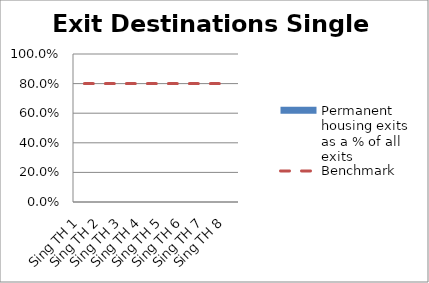
| Category | Permanent housing exits as a % of all exits |
|---|---|
| Sing TH 1 | 0 |
| Sing TH 2 | 0 |
| Sing TH 3 | 0 |
| Sing TH 4 | 0 |
| Sing TH 5 | 0 |
| Sing TH 6 | 0 |
| Sing TH 7 | 0 |
| Sing TH 8 | 0 |